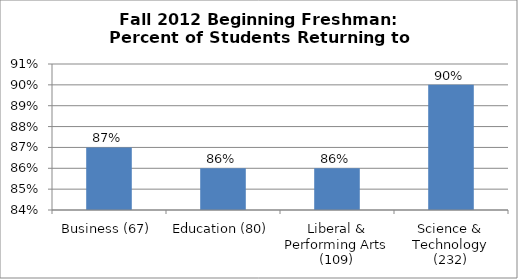
| Category | Series 0 |
|---|---|
| Business (67) | 0.87 |
| Education (80) | 0.86 |
| Liberal & Performing Arts (109) | 0.86 |
| Science & Technology (232) | 0.9 |